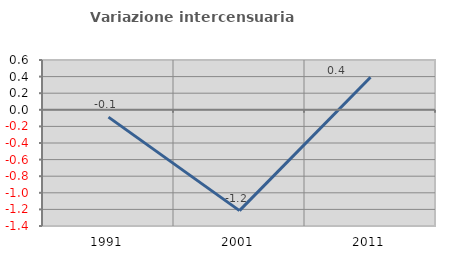
| Category | Variazione intercensuaria annua |
|---|---|
| 1991.0 | -0.088 |
| 2001.0 | -1.215 |
| 2011.0 | 0.393 |